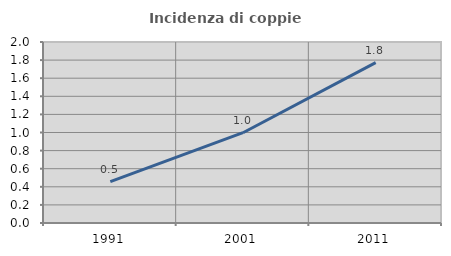
| Category | Incidenza di coppie miste |
|---|---|
| 1991.0 | 0.456 |
| 2001.0 | 0.998 |
| 2011.0 | 1.772 |